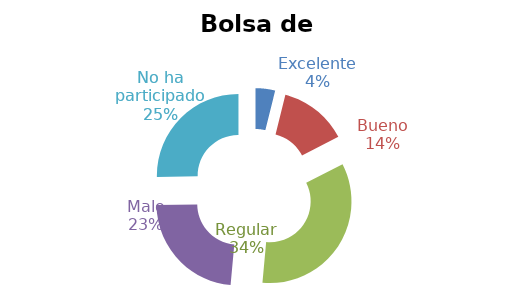
| Category | Series 0 |
|---|---|
| Excelente | 0.039 |
| Bueno | 0.136 |
| Regular | 0.34 |
| Malo | 0.233 |
| No ha participado | 0.252 |